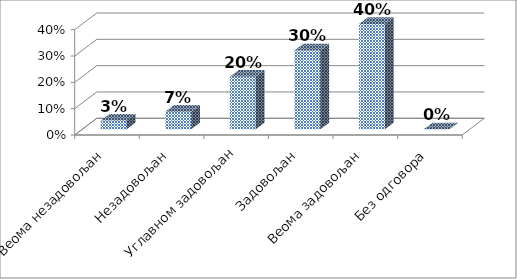
| Category | Series 0 |
|---|---|
| Веома незадовољан | 0.033 |
| Незадовољан | 0.067 |
| Углавном задовољан | 0.2 |
| Задовољан | 0.3 |
| Веома задовољан | 0.4 |
| Без одговора | 0 |